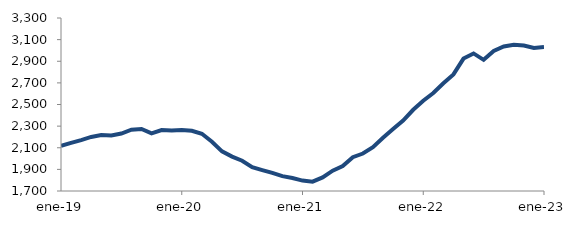
| Category | Series 0 |
|---|---|
| 2019-01-01 | 2116.727 |
| 2019-02-01 | 2144.876 |
| 2019-03-01 | 2171.077 |
| 2019-04-01 | 2199.941 |
| 2019-05-01 | 2218.125 |
| 2019-06-01 | 2213.708 |
| 2019-07-01 | 2231.834 |
| 2019-08-01 | 2267.321 |
| 2019-09-01 | 2273.768 |
| 2019-10-01 | 2233.304 |
| 2019-11-01 | 2263.898 |
| 2019-12-01 | 2259.926 |
| 2020-01-01 | 2265.053 |
| 2020-02-01 | 2256.766 |
| 2020-03-01 | 2229.161 |
| 2020-04-01 | 2155.791 |
| 2020-05-01 | 2066.843 |
| 2020-06-01 | 2018.026 |
| 2020-07-01 | 1979.558 |
| 2020-08-01 | 1920.368 |
| 2020-09-01 | 1893.237 |
| 2020-10-01 | 1867.4 |
| 2020-11-01 | 1837.195 |
| 2020-12-01 | 1819.546 |
| 2021-01-01 | 1796.45 |
| 2021-02-01 | 1786.603 |
| 2021-03-01 | 1826.072 |
| 2021-04-01 | 1887.798 |
| 2021-05-01 | 1930.372 |
| 2021-06-01 | 2012.926 |
| 2021-07-01 | 2046.434 |
| 2021-08-01 | 2105.806 |
| 2021-09-01 | 2192.514 |
| 2021-10-01 | 2272.972 |
| 2021-11-01 | 2351.334 |
| 2021-12-01 | 2451.171 |
| 2022-01-01 | 2534.613 |
| 2022-02-01 | 2606.357 |
| 2022-03-01 | 2696.948 |
| 2022-04-01 | 2778.264 |
| 2022-05-01 | 2924.682 |
| 2022-06-01 | 2972.281 |
| 2022-07-01 | 2912.933 |
| 2022-08-01 | 2994.913 |
| 2022-09-01 | 3036.467 |
| 2022-10-01 | 3052.236 |
| 2022-11-01 | 3044.767 |
| 2022-12-01 | 3023.141 |
| 2023-01-01 | 3030.956 |